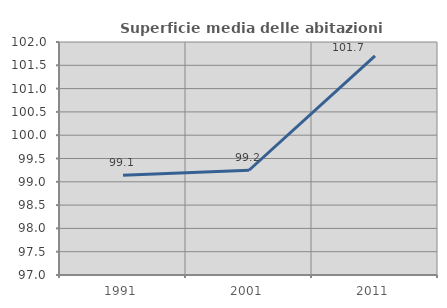
| Category | Superficie media delle abitazioni occupate |
|---|---|
| 1991.0 | 99.141 |
| 2001.0 | 99.248 |
| 2011.0 | 101.702 |